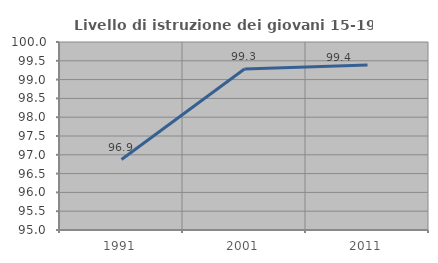
| Category | Livello di istruzione dei giovani 15-19 anni |
|---|---|
| 1991.0 | 96.875 |
| 2001.0 | 99.281 |
| 2011.0 | 99.39 |